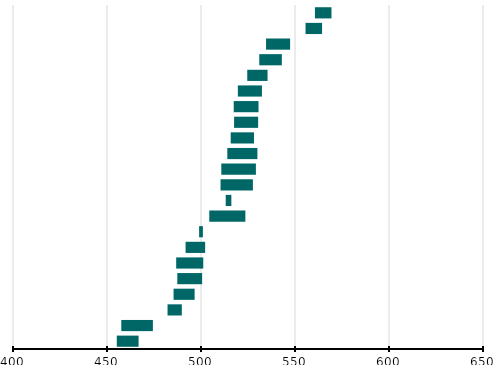
| Category | Series 0 | Series 1 |
|---|---|---|
| Japon | 560.6 | 8.8 |
| Corée | 555.6 | 8.8 |
| Finlande | 534.6 | 12.8 |
| Lituanie | 531 | 12 |
| Hongrie | 524.6 | 10.8 |
| Australie | 519.6 | 12.8 |
| Suède | 517.4 | 13.2 |
| Portugal | 517.6 | 12.8 |
| Irlande | 515.8 | 12.4 |
| Turquie | 514 | 16 |
| États-Unis | 510.8 | 18.4 |
| Israël | 510.4 | 17.2 |
| Moyenne Internationale (UE et/ou OCDE) | 513.153 | 2.993 |
| Angleterre | 504.4 | 19.2 |
| Centre de l'échelle TIMSS | 499 | 2 |
| Italie | 491.8 | 10.4 |
| Nouvelle-Zélande | 486.8 | 14.4 |
| Norvège* | 487.4 | 13.2 |
| France | 485.4 | 11.2 |
| Chypre | 482.2 | 7.6 |
| Roumanie | 457.6 | 16.8 |
| Chili | 455.2 | 11.6 |